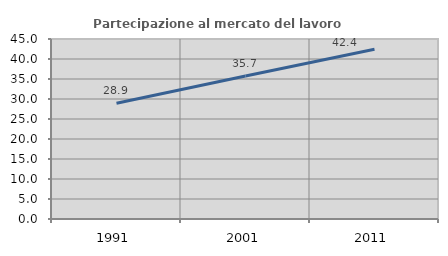
| Category | Partecipazione al mercato del lavoro  femminile |
|---|---|
| 1991.0 | 28.924 |
| 2001.0 | 35.748 |
| 2011.0 | 42.446 |